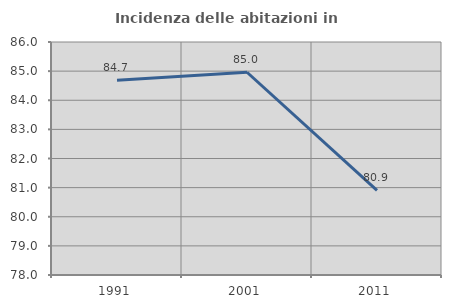
| Category | Incidenza delle abitazioni in proprietà  |
|---|---|
| 1991.0 | 84.69 |
| 2001.0 | 84.961 |
| 2011.0 | 80.905 |